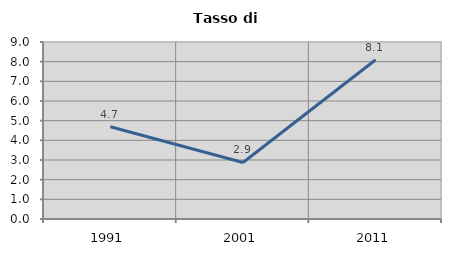
| Category | Tasso di disoccupazione   |
|---|---|
| 1991.0 | 4.688 |
| 2001.0 | 2.874 |
| 2011.0 | 8.094 |